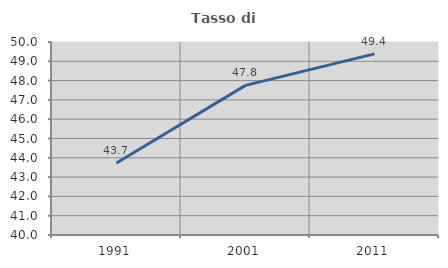
| Category | Tasso di occupazione   |
|---|---|
| 1991.0 | 43.728 |
| 2001.0 | 47.752 |
| 2011.0 | 49.384 |